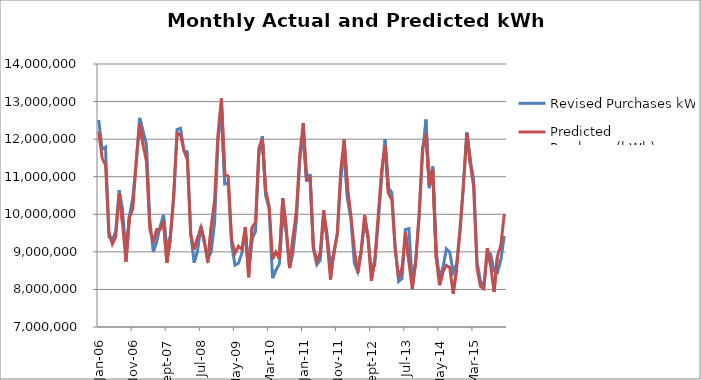
| Category | Revised Purchases kWh | Predicted Purchases(kWh) |
|---|---|---|
| 2006-01-31 | 12508470 | 12205947.44 |
| 2006-02-28 | 11727560 | 11503397.064 |
| 2006-03-31 | 11784150 | 11311757.953 |
| 2006-04-30 | 9406440 | 9524122.005 |
| 2006-05-31 | 9293920 | 9210610.469 |
| 2006-06-30 | 9564320 | 9400871.706 |
| 2006-07-31 | 10639870 | 10546677.774 |
| 2006-08-31 | 10096480 | 9752983.489 |
| 2006-09-30 | 8938560 | 8732666.114 |
| 2006-10-31 | 9952100 | 9903229.194 |
| 2006-11-30 | 10436420 | 10140039.631 |
| 2006-12-31 | 11345280 | 11423640.189 |
| 2007-01-31 | 12568180 | 12403298.926 |
| 2007-02-28 | 12210720 | 11866943.181 |
| 2007-03-31 | 11873120 | 11411737.12 |
| 2007-04-30 | 9854780 | 9609982.791 |
| 2007-05-31 | 9000430 | 9253813.627 |
| 2007-06-30 | 9265780 | 9593766.871 |
| 2007-07-31 | 9662330 | 9592150.542 |
| 2007-08-31 | 9982760 | 9820372.635 |
| 2007-09-30 | 9063690 | 8709245.184 |
| 2007-10-31 | 9402850 | 9327728.734 |
| 2007-11-30 | 10423660 | 10509652.987 |
| 2007-12-31 | 12253260 | 12157979.342 |
| 2008-01-31 | 12288190 | 12109346.423 |
| 2008-02-29 | 11701800 | 11698139.982 |
| 2008-03-31 | 11663590 | 11460150.208 |
| 2008-04-30 | 9464610 | 9463017.403 |
| 2008-05-31 | 8709540 | 9059801.93 |
| 2008-06-30 | 9032720 | 9367119.457 |
| 2008-07-31 | 9681910 | 9649957.074 |
| 2008-08-31 | 9241240 | 9301282.165 |
| 2008-09-30 | 8800520 | 8714198.573 |
| 2008-10-31 | 8997790 | 9668081.783 |
| 2008-11-30 | 9775270 | 10371786.174 |
| 2008-12-31 | 11977460 | 12130689.064 |
| 2009-01-31 | 12715660 | 13081989.096 |
| 2009-02-28 | 10806911 | 11064839.859 |
| 2009-03-31 | 10822297 | 11013026.123 |
| 2009-04-30 | 9188119 | 9321375.174 |
| 2009-05-31 | 8646669 | 8964840.44 |
| 2009-06-30 | 8694745 | 9148846.319 |
| 2009-07-31 | 8965453 | 9066574.576 |
| 2009-08-31 | 9534995 | 9656067.325 |
| 2009-09-30 | 8543544 | 8324383.011 |
| 2009-10-31 | 9341679 | 9651434.164 |
| 2009-11-30 | 9542500 | 9788310.26 |
| 2009-12-31 | 11612258 | 11761429.818 |
| 2010-01-31 | 12078338 | 12011161.081 |
| 2010-02-28 | 10494800 | 10635915.15 |
| 2010-03-31 | 10154062 | 10214663.607 |
| 2010-04-30 | 8300785 | 8810462.078 |
| 2010-05-31 | 8510046 | 8998438.492 |
| 2010-06-30 | 8680146 | 8813004.775 |
| 2010-07-31 | 9983854 | 10423573.752 |
| 2010-08-31 | 9543754 | 9664490.855 |
| 2010-09-30 | 8579877 | 8568101.338 |
| 2010-10-31 | 8994685 | 9379975.668 |
| 2010-11-30 | 9833800 | 10084481.057 |
| 2010-12-31 | 11438554 | 11593334.981 |
| 2011-01-31 | 12132585 | 12427806.574 |
| 2011-02-28 | 10868253 | 10930997.155 |
| 2011-03-31 | 11068641 | 10957149.09 |
| 2011-04-30 | 9074817 | 9124654.994 |
| 2011-05-31 | 8658879 | 8750424.912 |
| 2011-06-30 | 8778920 | 8978685.618 |
| 2011-07-31 | 10001581 | 10104366.275 |
| 2011-08-31 | 9454436 | 9333675.868 |
| 2011-09-30 | 8634961 | 8261881.65 |
| 2011-10-31 | 8927131 | 9011169.482 |
| 2011-11-30 | 9482575 | 9466738.959 |
| 2011-12-31 | 10919663 | 11149256.917 |
| 2012-01-31 | 11700330 | 11987533.041 |
| 2012-02-29 | 10395841 | 10725504.028 |
| 2012-03-31 | 9872024 | 9965794.56 |
| 2012-04-30 | 8707449 | 9063074.565 |
| 2012-05-31 | 8480484 | 8437940.476 |
| 2012-06-30 | 9037032 | 9009304.659 |
| 2012-07-31 | 9784872 | 9979759.724 |
| 2012-08-31 | 9438341 | 9381739.013 |
| 2012-09-30 | 8463793 | 8230378.736 |
| 2012-10-31 | 8669407 | 8795692.467 |
| 2012-11-30 | 9769730 | 9959068.801 |
| 2012-12-31 | 10961744 | 11162376.641 |
| 2013-01-31 | 12001052 | 11835445.848 |
| 2013-02-28 | 10703797 | 10561216.674 |
| 2013-03-31 | 10577021 | 10395948.843 |
| 2013-04-30 | 9121662 | 9058614.879 |
| 2013-05-31 | 8211243 | 8302062.632 |
| 2013-06-30 | 8287581 | 8570875.041 |
| 2013-07-31 | 9598701 | 9516321.244 |
| 2013-08-31 | 9619248 | 8735855.434 |
| 2013-09-30 | 8194773 | 8016717.258 |
| 2013-10-31 | 8732069 | 8747439.507 |
| 2013-11-30 | 9931378 | 9977662.108 |
| 2013-12-31 | 11616941 | 11753831.835 |
| 2014-01-31 | 12522131 | 12129174.166 |
| 2014-02-28 | 10695468 | 10776770.227 |
| 2014-03-31 | 11273530 | 11206118.855 |
| 2014-04-30 | 9031993 | 8844425.673 |
| 2014-05-31 | 8286920 | 8110971.025 |
| 2014-06-30 | 8579731 | 8466411.73 |
| 2014-07-31 | 9080121 | 8639518.171 |
| 2014-08-31 | 8989250 | 8582014.203 |
| 2014-09-30 | 8464550 | 7883709.666 |
| 2014-10-31 | 8670762 | 8546605.034 |
| 2014-11-30 | 9598673 | 9528881.885 |
| 2014-12-31 | 10755419 | 10769554.469 |
| 2015-01-31 | 12180927.15 | 12158148.116 |
| 2015-02-28 | 11448305.18 | 11365877.304 |
| 2015-03-31 | 10924977.36 | 10747023.052 |
| 2015-04-30 | 8731936 | 8565684.555 |
| 2015-05-31 | 8223122.57 | 8078963.199 |
| 2015-06-30 | 8092658.46 | 8019204.317 |
| 2015-07-31 | 8978804.46 | 9100934.264 |
| 2015-08-31 | 8939421.91 | 8635690.735 |
| 2015-09-30 | 8496700.68 | 7931287.353 |
| 2015-10-31 | 8450501.81 | 8889275.037 |
| 2015-11-30 | 8794018.02 | 9186902.512 |
| 2015-12-31 | 9423404.35 | 10008599.229 |